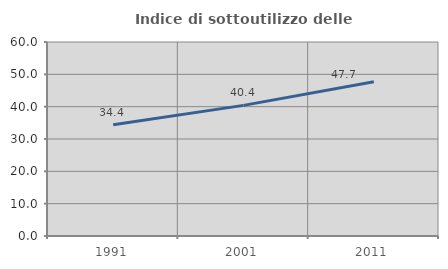
| Category | Indice di sottoutilizzo delle abitazioni  |
|---|---|
| 1991.0 | 34.383 |
| 2001.0 | 40.404 |
| 2011.0 | 47.704 |